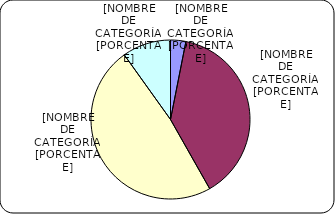
| Category | Series 0 |
|---|---|
| Menores de 3% | 414.6 |
| Entre 3% y 6% | 5158.2 |
| Entre 6% y 8% | 6442.5 |
| Entre 8% y 9% | 1317.4 |